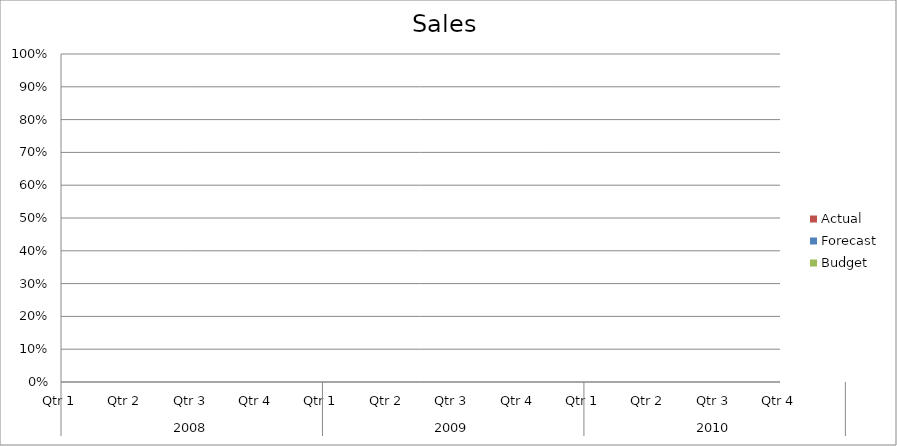
| Category | Budget | Forecast | Actual |
|---|---|---|---|
| 0 | 950 | 730 | 2390 |
| 1 | 2940 | 770 | 770 |
| 2 | 2930 | 2120 | 3430 |
| 3 | 2390 | 610 | 2860 |
| 4 | 3240 | 1140 | 560 |
| 5 | 1170 | 2480 | 2370 |
| 6 | 2230 | 3280 | 590 |
| 7 | 1230 | 2860 | 2780 |
| 8 | 750 | 2690 | 830 |
| 9 | 730 | 1730 | 560 |
| 10 | 1560 | 1360 | 2180 |
| 11 | 2170 | 2110 | 2850 |